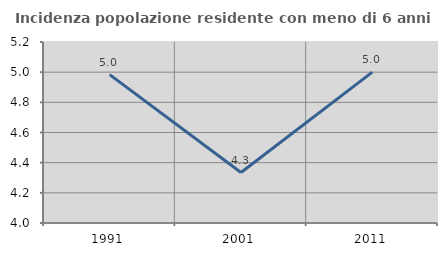
| Category | Incidenza popolazione residente con meno di 6 anni |
|---|---|
| 1991.0 | 4.984 |
| 2001.0 | 4.334 |
| 2011.0 | 5 |